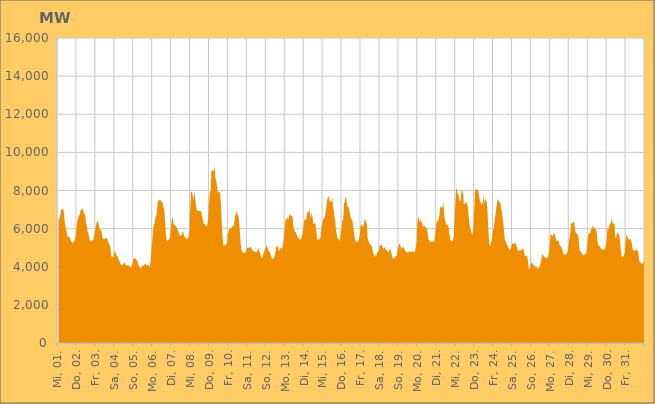
| Category | Series 0 |
|---|---|
|  Mi, 01.  | 6432.189 |
|  Mi, 01.  | 6545.215 |
|  Mi, 01.  | 6547.513 |
|  Mi, 01.  | 6901.822 |
|  Mi, 01.  | 7033.395 |
|  Mi, 01.  | 6983.511 |
|  Mi, 01.  | 7067.825 |
|  Mi, 01.  | 6830.538 |
|  Mi, 01.  | 6334.75 |
|  Mi, 01.  | 6100.284 |
|  Mi, 01.  | 5940.601 |
|  Mi, 01.  | 5646.57 |
|  Mi, 01.  | 5559.385 |
|  Mi, 01.  | 5585.268 |
|  Mi, 01.  | 5539.863 |
|  Mi, 01.  | 5465.039 |
|  Mi, 01.  | 5310.329 |
|  Do, 02.  | 5300.717 |
|  Do, 02.  | 5241.493 |
|  Do, 02.  | 5289.908 |
|  Do, 02.  | 5325.66 |
|  Do, 02.  | 5446.037 |
|  Do, 02.  | 5623.164 |
|  Do, 02.  | 6062.127 |
|  Do, 02.  | 6423.494 |
|  Do, 02.  | 6573.263 |
|  Do, 02.  | 6698.246 |
|  Do, 02.  | 6696.247 |
|  Do, 02.  | 6977.927 |
|  Do, 02.  | 6984.089 |
|  Do, 02.  | 6992.329 |
|  Do, 02.  | 7078.228 |
|  Do, 02.  | 6831.044 |
|  Do, 02.  | 6778.405 |
|  Do, 02.  | 6714.394 |
|  Do, 02.  | 6312.949 |
|  Do, 02.  | 6146.983 |
|  Do, 02.  | 5851.683 |
|  Do, 02.  | 5729.765 |
|  Do, 02.  | 5532.291 |
|  Do, 02.  | 5377.832 |
|  Fr, 03.  | 5333.076 |
|  Fr, 03.  | 5329.212 |
|  Fr, 03.  | 5386.18 |
|  Fr, 03.  | 5387.183 |
|  Fr, 03.  | 5541.794 |
|  Fr, 03.  | 5736.959 |
|  Fr, 03.  | 6015.82 |
|  Fr, 03.  | 6272.881 |
|  Fr, 03.  | 6377.523 |
|  Fr, 03.  | 6374.856 |
|  Fr, 03.  | 6254.357 |
|  Fr, 03.  | 6020.06 |
|  Fr, 03.  | 5908.724 |
|  Fr, 03.  | 5984.108 |
|  Fr, 03.  | 5743.847 |
|  Fr, 03.  | 5483.723 |
|  Fr, 03.  | 5459.95 |
|  Fr, 03.  | 5486.527 |
|  Fr, 03.  | 5451.765 |
|  Fr, 03.  | 5492.21 |
|  Fr, 03.  | 5514.966 |
|  Fr, 03.  | 5483.49 |
|  Fr, 03.  | 5310.554 |
|  Fr, 03.  | 5221.88 |
|  Sa, 04.  | 5140.734 |
|  Sa, 04.  | 4992.717 |
|  Sa, 04.  | 4520.739 |
|  Sa, 04.  | 4540.209 |
|  Sa, 04.  | 4513.63 |
|  Sa, 04.  | 4517.864 |
|  Sa, 04.  | 4829.307 |
|  Sa, 04.  | 4780.2 |
|  Sa, 04.  | 4669.113 |
|  Sa, 04.  | 4563.547 |
|  Sa, 04.  | 4548.749 |
|  Sa, 04.  | 4423.104 |
|  Sa, 04.  | 4321.182 |
|  Sa, 04.  | 4215.574 |
|  Sa, 04.  | 4150.56 |
|  Sa, 04.  | 4078.71 |
|  Sa, 04.  | 4077.027 |
|  Sa, 04.  | 4158.97 |
|  Sa, 04.  | 4192.498 |
|  Sa, 04.  | 4241 |
|  Sa, 04.  | 4085.512 |
|  Sa, 04.  | 4112.892 |
|  Sa, 04.  | 4031.316 |
|  Sa, 04.  | 4084.826 |
|  So, 05.  | 4051.562 |
|  So, 05.  | 3996.195 |
|  So, 05.  | 3998.724 |
|  So, 05.  | 3918.393 |
|  So, 05.  | 4094.268 |
|  So, 05.  | 4151.866 |
|  So, 05.  | 4410.688 |
|  So, 05.  | 4438.842 |
|  So, 05.  | 4440.331 |
|  So, 05.  | 4397.355 |
|  So, 05.  | 4384.611 |
|  So, 05.  | 4299.291 |
|  So, 05.  | 4175.3 |
|  So, 05.  | 3990.685 |
|  So, 05.  | 3976.586 |
|  So, 05.  | 3912.099 |
|  So, 05.  | 3919.865 |
|  So, 05.  | 4035.484 |
|  So, 05.  | 4111.312 |
|  So, 05.  | 4013.534 |
|  So, 05.  | 4125.773 |
|  So, 05.  | 4187.586 |
|  So, 05.  | 4081.242 |
|  So, 05.  | 4077.027 |
|  Mo, 06.  | 4086.107 |
|  Mo, 06.  | 4134.495 |
|  Mo, 06.  | 3980.735 |
|  Mo, 06.  | 4034.878 |
|  Mo, 06.  | 4346.044 |
|  Mo, 06.  | 4869.953 |
|  Mo, 06.  | 5367.1 |
|  Mo, 06.  | 5914.365 |
|  Mo, 06.  | 6238.811 |
|  Mo, 06.  | 6244.058 |
|  Mo, 06.  | 6586.615 |
|  Mo, 06.  | 6661.785 |
|  Mo, 06.  | 6970.841 |
|  Mo, 06.  | 7408.202 |
|  Mo, 06.  | 7461.79 |
|  Mo, 06.  | 7534.47 |
|  Mo, 06.  | 7460.864 |
|  Mo, 06.  | 7505.971 |
|  Mo, 06.  | 7344.519 |
|  Mo, 06.  | 7391.068 |
|  Mo, 06.  | 7114.521 |
|  Mo, 06.  | 7042.037 |
|  Mo, 06.  | 6600.72 |
|  Mo, 06.  | 5789.094 |
|  Di, 07.  | 5408.973 |
|  Di, 07.  | 5345.55 |
|  Di, 07.  | 5394.59 |
|  Di, 07.  | 5407.276 |
|  Di, 07.  | 5491.242 |
|  Di, 07.  | 5680.061 |
|  Di, 07.  | 6148.901 |
|  Di, 07.  | 6555.24 |
|  Di, 07.  | 6570.468 |
|  Di, 07.  | 6251.604 |
|  Di, 07.  | 6169.385 |
|  Di, 07.  | 6199.727 |
|  Di, 07.  | 6102.451 |
|  Di, 07.  | 6070.755 |
|  Di, 07.  | 5977.898 |
|  Di, 07.  | 5824.963 |
|  Di, 07.  | 5750.545 |
|  Di, 07.  | 5605.576 |
|  Di, 07.  | 5630.129 |
|  Di, 07.  | 5643.744 |
|  Di, 07.  | 5844.267 |
|  Di, 07.  | 5821.324 |
|  Di, 07.  | 5681.039 |
|  Di, 07.  | 5559.406 |
|  Mi, 08.  | 5526.208 |
|  Mi, 08.  | 5487.472 |
|  Mi, 08.  | 5418.346 |
|  Mi, 08.  | 5492.679 |
|  Mi, 08.  | 5596.769 |
|  Mi, 08.  | 5858.635 |
|  Mi, 08.  | 6875.682 |
|  Mi, 08.  | 7923.531 |
|  Mi, 08.  | 7939.218 |
|  Mi, 08.  | 7786.351 |
|  Mi, 08.  | 7463.835 |
|  Mi, 08.  | 7909.508 |
|  Mi, 08.  | 7713.217 |
|  Mi, 08.  | 7334.479 |
|  Mi, 08.  | 7039.499 |
|  Mi, 08.  | 6927.108 |
|  Mi, 08.  | 6941.94 |
|  Mi, 08.  | 6926.442 |
|  Mi, 08.  | 6932.826 |
|  Mi, 08.  | 6904.032 |
|  Mi, 08.  | 6931.714 |
|  Mi, 08.  | 6655.38 |
|  Mi, 08.  | 6481.982 |
|  Mi, 08.  | 6286.74 |
|  Do, 09.  | 6244.257 |
|  Do, 09.  | 6205.257 |
|  Do, 09.  | 6117.69 |
|  Do, 09.  | 6141.406 |
|  Do, 09.  | 6213.858 |
|  Do, 09.  | 6678.971 |
|  Do, 09.  | 7334.385 |
|  Do, 09.  | 7920.454 |
|  Do, 09.  | 7958.575 |
|  Do, 09.  | 9056.361 |
|  Do, 09.  | 9044.602 |
|  Do, 09.  | 9066.344 |
|  Do, 09.  | 9002.834 |
|  Do, 09.  | 9272.565 |
|  Do, 09.  | 8669.864 |
|  Do, 09.  | 8517.835 |
|  Do, 09.  | 8205.627 |
|  Do, 09.  | 7964.013 |
|  Do, 09.  | 7887.21 |
|  Do, 09.  | 7901.468 |
|  Do, 09.  | 7910.298 |
|  Do, 09.  | 7246.571 |
|  Do, 09.  | 6341.555 |
|  Do, 09.  | 5608.565 |
|  Fr, 10.  | 5118.057 |
|  Fr, 10.  | 5140.781 |
|  Fr, 10.  | 5102.667 |
|  Fr, 10.  | 5167.676 |
|  Fr, 10.  | 5181.313 |
|  Fr, 10.  | 5302.378 |
|  Fr, 10.  | 5709.381 |
|  Fr, 10.  | 5936.839 |
|  Fr, 10.  | 6003.604 |
|  Fr, 10.  | 6037.304 |
|  Fr, 10.  | 5973.486 |
|  Fr, 10.  | 6170.352 |
|  Fr, 10.  | 6124.762 |
|  Fr, 10.  | 6076.152 |
|  Fr, 10.  | 6361.854 |
|  Fr, 10.  | 6649.129 |
|  Fr, 10.  | 6752.071 |
|  Fr, 10.  | 6950.284 |
|  Fr, 10.  | 6756.815 |
|  Fr, 10.  | 6698.703 |
|  Fr, 10.  | 6383.654 |
|  Fr, 10.  | 5856.289 |
|  Fr, 10.  | 5261.557 |
|  Fr, 10.  | 4857.342 |
|  Sa, 11.  | 4816.497 |
|  Sa, 11.  | 4717.448 |
|  Sa, 11.  | 4730.779 |
|  Sa, 11.  | 4736.928 |
|  Sa, 11.  | 4733.401 |
|  Sa, 11.  | 4797.706 |
|  Sa, 11.  | 4990.911 |
|  Sa, 11.  | 5012.251 |
|  Sa, 11.  | 5009.106 |
|  Sa, 11.  | 4994.828 |
|  Sa, 11.  | 5020.215 |
|  Sa, 11.  | 5044.988 |
|  Sa, 11.  | 4945.124 |
|  Sa, 11.  | 4848.309 |
|  Sa, 11.  | 4828.483 |
|  Sa, 11.  | 4817.915 |
|  Sa, 11.  | 4763.25 |
|  Sa, 11.  | 4764.954 |
|  Sa, 11.  | 4764.098 |
|  Sa, 11.  | 4793.053 |
|  Sa, 11.  | 4948.968 |
|  Sa, 11.  | 4937.129 |
|  Sa, 11.  | 4788.311 |
|  Sa, 11.  | 4631.645 |
|  So, 12.  | 4544.594 |
|  So, 12.  | 4453.896 |
|  So, 12.  | 4488.792 |
|  So, 12.  | 4740.289 |
|  So, 12.  | 4825.721 |
|  So, 12.  | 4931.086 |
|  So, 12.  | 4976.784 |
|  So, 12.  | 5168.841 |
|  So, 12.  | 5034.123 |
|  So, 12.  | 4875.734 |
|  So, 12.  | 4832.097 |
|  So, 12.  | 4721.07 |
|  So, 12.  | 4610.855 |
|  So, 12.  | 4515.428 |
|  So, 12.  | 4418.938 |
|  So, 12.  | 4385.718 |
|  So, 12.  | 4445.788 |
|  So, 12.  | 4528.651 |
|  So, 12.  | 4742.813 |
|  So, 12.  | 5008.71 |
|  So, 12.  | 5092.76 |
|  So, 12.  | 5077.151 |
|  So, 12.  | 4833.736 |
|  So, 12.  | 4842.457 |
|  Mo, 13.  | 4988.085 |
|  Mo, 13.  | 4974.977 |
|  Mo, 13.  | 4893.55 |
|  Mo, 13.  | 5082.106 |
|  Mo, 13.  | 5263.83 |
|  Mo, 13.  | 5567.088 |
|  Mo, 13.  | 6093.246 |
|  Mo, 13.  | 6523.03 |
|  Mo, 13.  | 6459.348 |
|  Mo, 13.  | 6654.612 |
|  Mo, 13.  | 6439.946 |
|  Mo, 13.  | 6529.272 |
|  Mo, 13.  | 6724.267 |
|  Mo, 13.  | 6762.513 |
|  Mo, 13.  | 6654.413 |
|  Mo, 13.  | 6657.81 |
|  Mo, 13.  | 6538.919 |
|  Mo, 13.  | 6033.566 |
|  Mo, 13.  | 5947.788 |
|  Mo, 13.  | 5807.496 |
|  Mo, 13.  | 5824.847 |
|  Mo, 13.  | 5685.974 |
|  Mo, 13.  | 5559.084 |
|  Mo, 13.  | 5560.489 |
|  Di, 14.  | 5455.978 |
|  Di, 14.  | 5411.861 |
|  Di, 14.  | 5452.754 |
|  Di, 14.  | 5474.387 |
|  Di, 14.  | 5613.657 |
|  Di, 14.  | 5878.572 |
|  Di, 14.  | 6276.342 |
|  Di, 14.  | 6489.839 |
|  Di, 14.  | 6493.187 |
|  Di, 14.  | 6414.928 |
|  Di, 14.  | 6781.622 |
|  Di, 14.  | 6899.244 |
|  Di, 14.  | 6823.975 |
|  Di, 14.  | 7038.672 |
|  Di, 14.  | 6751.466 |
|  Di, 14.  | 6506.957 |
|  Di, 14.  | 6865.055 |
|  Di, 14.  | 6646.156 |
|  Di, 14.  | 6236.148 |
|  Di, 14.  | 6266.64 |
|  Di, 14.  | 6320.091 |
|  Di, 14.  | 6145.898 |
|  Di, 14.  | 5858.031 |
|  Di, 14.  | 5441.387 |
|  Mi, 15.  | 5365.633 |
|  Mi, 15.  | 5481.591 |
|  Mi, 15.  | 5451.426 |
|  Mi, 15.  | 5482.707 |
|  Mi, 15.  | 5943.905 |
|  Mi, 15.  | 6157.883 |
|  Mi, 15.  | 6375.539 |
|  Mi, 15.  | 6519.376 |
|  Mi, 15.  | 6568.058 |
|  Mi, 15.  | 6641.351 |
|  Mi, 15.  | 6985.18 |
|  Mi, 15.  | 7267.223 |
|  Mi, 15.  | 7583.222 |
|  Mi, 15.  | 7715.765 |
|  Mi, 15.  | 7625.234 |
|  Mi, 15.  | 7367.856 |
|  Mi, 15.  | 7416.664 |
|  Mi, 15.  | 7418.877 |
|  Mi, 15.  | 7657.66 |
|  Mi, 15.  | 7164.366 |
|  Mi, 15.  | 6971.208 |
|  Mi, 15.  | 6579.811 |
|  Mi, 15.  | 6379.543 |
|  Mi, 15.  | 5874.329 |
|  Do, 16.  | 5629.912 |
|  Do, 16.  | 5488.079 |
|  Do, 16.  | 5453.622 |
|  Do, 16.  | 5317.596 |
|  Do, 16.  | 5445.179 |
|  Do, 16.  | 5727.747 |
|  Do, 16.  | 6070.183 |
|  Do, 16.  | 6482.532 |
|  Do, 16.  | 6429.243 |
|  Do, 16.  | 7328.717 |
|  Do, 16.  | 7399.6 |
|  Do, 16.  | 7704.249 |
|  Do, 16.  | 7537.075 |
|  Do, 16.  | 7158.356 |
|  Do, 16.  | 7177.171 |
|  Do, 16.  | 7088.932 |
|  Do, 16.  | 6888.273 |
|  Do, 16.  | 6694.481 |
|  Do, 16.  | 6431.258 |
|  Do, 16.  | 6582.17 |
|  Do, 16.  | 6290.071 |
|  Do, 16.  | 6007.884 |
|  Do, 16.  | 5669.406 |
|  Do, 16.  | 5410.609 |
|  Fr, 17.  | 5333.906 |
|  Fr, 17.  | 5306.443 |
|  Fr, 17.  | 5274.779 |
|  Fr, 17.  | 5321.512 |
|  Fr, 17.  | 5480.704 |
|  Fr, 17.  | 5633.583 |
|  Fr, 17.  | 6115.531 |
|  Fr, 17.  | 6233.811 |
|  Fr, 17.  | 6173.681 |
|  Fr, 17.  | 6095.939 |
|  Fr, 17.  | 6162.593 |
|  Fr, 17.  | 6505.184 |
|  Fr, 17.  | 6457.856 |
|  Fr, 17.  | 6336.969 |
|  Fr, 17.  | 6231.604 |
|  Fr, 17.  | 5489.921 |
|  Fr, 17.  | 5369.647 |
|  Fr, 17.  | 5255.822 |
|  Fr, 17.  | 5178.818 |
|  Fr, 17.  | 5171.887 |
|  Fr, 17.  | 5045.025 |
|  Fr, 17.  | 4928.77 |
|  Fr, 17.  | 4713 |
|  Fr, 17.  | 4626.61 |
|  Sa, 18.  | 4520.267 |
|  Sa, 18.  | 4624.376 |
|  Sa, 18.  | 4577.068 |
|  Sa, 18.  | 4755.326 |
|  Sa, 18.  | 4801.279 |
|  Sa, 18.  | 4798.432 |
|  Sa, 18.  | 5083.276 |
|  Sa, 18.  | 5092.189 |
|  Sa, 18.  | 5152.022 |
|  Sa, 18.  | 5140.321 |
|  Sa, 18.  | 5000.28 |
|  Sa, 18.  | 4915.656 |
|  Sa, 18.  | 5041.086 |
|  Sa, 18.  | 4984.222 |
|  Sa, 18.  | 4851.161 |
|  Sa, 18.  | 4906.766 |
|  Sa, 18.  | 4824.768 |
|  Sa, 18.  | 4752.459 |
|  Sa, 18.  | 4767.788 |
|  Sa, 18.  | 4949.749 |
|  Sa, 18.  | 4900.707 |
|  Sa, 18.  | 4746.932 |
|  Sa, 18.  | 4525.613 |
|  Sa, 18.  | 4424.328 |
|  So, 19.  | 4477.872 |
|  So, 19.  | 4447.882 |
|  So, 19.  | 4547.452 |
|  So, 19.  | 4530.999 |
|  So, 19.  | 4641.91 |
|  So, 19.  | 4831.258 |
|  So, 19.  | 5038.062 |
|  So, 19.  | 5224.994 |
|  So, 19.  | 5176.374 |
|  So, 19.  | 5018.141 |
|  So, 19.  | 4918.391 |
|  So, 19.  | 5045.843 |
|  So, 19.  | 5024.135 |
|  So, 19.  | 5001.422 |
|  So, 19.  | 4853.505 |
|  So, 19.  | 4808.358 |
|  So, 19.  | 4807.395 |
|  So, 19.  | 4715.442 |
|  So, 19.  | 4726.697 |
|  So, 19.  | 4777.87 |
|  So, 19.  | 4801.317 |
|  So, 19.  | 4822.244 |
|  So, 19.  | 4748.168 |
|  So, 19.  | 4794.939 |
|  Mo, 20.  | 4802.96 |
|  Mo, 20.  | 4808.074 |
|  Mo, 20.  | 4756.099 |
|  Mo, 20.  | 4754.025 |
|  Mo, 20.  | 5083.369 |
|  Mo, 20.  | 5293.754 |
|  Mo, 20.  | 6301.903 |
|  Mo, 20.  | 6605.361 |
|  Mo, 20.  | 6567.503 |
|  Mo, 20.  | 6382.233 |
|  Mo, 20.  | 6388.743 |
|  Mo, 20.  | 6383.937 |
|  Mo, 20.  | 6211.965 |
|  Mo, 20.  | 6130.845 |
|  Mo, 20.  | 6104.223 |
|  Mo, 20.  | 6156.347 |
|  Mo, 20.  | 6065.637 |
|  Mo, 20.  | 6005.625 |
|  Mo, 20.  | 6016.557 |
|  Mo, 20.  | 5743.153 |
|  Mo, 20.  | 5460.902 |
|  Mo, 20.  | 5389.448 |
|  Mo, 20.  | 5332.56 |
|  Mo, 20.  | 5307.433 |
|  Di, 21.  | 5303.928 |
|  Di, 21.  | 5339.538 |
|  Di, 21.  | 5337.287 |
|  Di, 21.  | 5255.12 |
|  Di, 21.  | 5499.273 |
|  Di, 21.  | 5797.62 |
|  Di, 21.  | 6253.985 |
|  Di, 21.  | 6426.251 |
|  Di, 21.  | 6378.829 |
|  Di, 21.  | 6537.806 |
|  Di, 21.  | 6727.516 |
|  Di, 21.  | 7159.301 |
|  Di, 21.  | 7163.916 |
|  Di, 21.  | 7061.781 |
|  Di, 21.  | 7144.179 |
|  Di, 21.  | 7392.529 |
|  Di, 21.  | 6692.183 |
|  Di, 21.  | 6465.051 |
|  Di, 21.  | 6300.135 |
|  Di, 21.  | 6169.698 |
|  Di, 21.  | 6260.59 |
|  Di, 21.  | 6128.506 |
|  Di, 21.  | 5985.263 |
|  Di, 21.  | 5559.124 |
|  Mi, 22.  | 5408.242 |
|  Mi, 22.  | 5334.832 |
|  Mi, 22.  | 5351.111 |
|  Mi, 22.  | 5380.72 |
|  Mi, 22.  | 5600.526 |
|  Mi, 22.  | 6256.168 |
|  Mi, 22.  | 7181.526 |
|  Mi, 22.  | 8073.064 |
|  Mi, 22.  | 8072.66 |
|  Mi, 22.  | 7859.075 |
|  Mi, 22.  | 7792.193 |
|  Mi, 22.  | 7550.487 |
|  Mi, 22.  | 7403.602 |
|  Mi, 22.  | 7537.453 |
|  Mi, 22.  | 8074.146 |
|  Mi, 22.  | 7960.584 |
|  Mi, 22.  | 7817.801 |
|  Mi, 22.  | 7258.759 |
|  Mi, 22.  | 7285.246 |
|  Mi, 22.  | 7375.989 |
|  Mi, 22.  | 7396.033 |
|  Mi, 22.  | 7295 |
|  Mi, 22.  | 7095.24 |
|  Mi, 22.  | 6671.204 |
|  Do, 23.  | 6228.97 |
|  Do, 23.  | 5940.523 |
|  Do, 23.  | 5921.492 |
|  Do, 23.  | 5705.996 |
|  Do, 23.  | 5721.541 |
|  Do, 23.  | 6002.974 |
|  Do, 23.  | 6907.295 |
|  Do, 23.  | 7968.546 |
|  Do, 23.  | 8139.502 |
|  Do, 23.  | 7998.317 |
|  Do, 23.  | 8067.312 |
|  Do, 23.  | 8002.173 |
|  Do, 23.  | 7767.789 |
|  Do, 23.  | 7513.743 |
|  Do, 23.  | 7400.422 |
|  Do, 23.  | 7263.726 |
|  Do, 23.  | 7268.806 |
|  Do, 23.  | 7347.945 |
|  Do, 23.  | 7728.531 |
|  Do, 23.  | 7284.93 |
|  Do, 23.  | 7555.835 |
|  Do, 23.  | 7498.159 |
|  Do, 23.  | 7365.847 |
|  Do, 23.  | 6783.162 |
|  Fr, 24.  | 5923.972 |
|  Fr, 24.  | 5170.537 |
|  Fr, 24.  | 5167.581 |
|  Fr, 24.  | 5092.624 |
|  Fr, 24.  | 5404.924 |
|  Fr, 24.  | 5659.903 |
|  Fr, 24.  | 5911.782 |
|  Fr, 24.  | 6080.099 |
|  Fr, 24.  | 6456.592 |
|  Fr, 24.  | 6744.308 |
|  Fr, 24.  | 7077.942 |
|  Fr, 24.  | 7364.631 |
|  Fr, 24.  | 7572.899 |
|  Fr, 24.  | 7442.753 |
|  Fr, 24.  | 7344.623 |
|  Fr, 24.  | 7444.569 |
|  Fr, 24.  | 7055.508 |
|  Fr, 24.  | 6909.982 |
|  Fr, 24.  | 6562.248 |
|  Fr, 24.  | 6294.041 |
|  Fr, 24.  | 5736.532 |
|  Fr, 24.  | 5379.965 |
|  Fr, 24.  | 5331.464 |
|  Fr, 24.  | 5227.462 |
|  Sa, 25.  | 5105.704 |
|  Sa, 25.  | 5044.739 |
|  Sa, 25.  | 4936.238 |
|  Sa, 25.  | 4857.401 |
|  Sa, 25.  | 4928.506 |
|  Sa, 25.  | 4978.557 |
|  Sa, 25.  | 5191.087 |
|  Sa, 25.  | 5219.682 |
|  Sa, 25.  | 5187.673 |
|  Sa, 25.  | 5238.428 |
|  Sa, 25.  | 5284.757 |
|  Sa, 25.  | 5155.954 |
|  Sa, 25.  | 5034.93 |
|  Sa, 25.  | 4893.81 |
|  Sa, 25.  | 4834.345 |
|  Sa, 25.  | 4887.723 |
|  Sa, 25.  | 4834.144 |
|  Sa, 25.  | 4867.615 |
|  Sa, 25.  | 4895.113 |
|  Sa, 25.  | 4925.233 |
|  Sa, 25.  | 4970.979 |
|  Sa, 25.  | 4813.963 |
|  Sa, 25.  | 4614.286 |
|  Sa, 25.  | 4524.527 |
|  So, 26.  | 4598.2 |
|  So, 26.  | 4566.184 |
|  So, 26.  | 4360.426 |
|  So, 26.  | 3925.507 |
|  So, 26.  | 3854.307 |
|  So, 26.  | 3963.629 |
|  So, 26.  | 4207.117 |
|  So, 26.  | 4224.445 |
|  So, 26.  | 4158.92 |
|  So, 26.  | 4084.248 |
|  So, 26.  | 4052.405 |
|  So, 26.  | 4032.7 |
|  So, 26.  | 3943.151 |
|  So, 26.  | 3980.182 |
|  So, 26.  | 3924.262 |
|  So, 26.  | 3848.495 |
|  So, 26.  | 3956.225 |
|  So, 26.  | 3958.628 |
|  So, 26.  | 4197.536 |
|  So, 26.  | 4342.063 |
|  So, 26.  | 4581.812 |
|  So, 26.  | 4695.907 |
|  So, 26.  | 4550.239 |
|  So, 26.  | 4502.482 |
|  Mo, 27.  | 4513.699 |
|  Mo, 27.  | 4450.298 |
|  Mo, 27.  | 4433.249 |
|  Mo, 27.  | 4474.785 |
|  Mo, 27.  | 4592.947 |
|  Mo, 27.  | 4821.938 |
|  Mo, 27.  | 5337.751 |
|  Mo, 27.  | 5690.638 |
|  Mo, 27.  | 5684.444 |
|  Mo, 27.  | 5587.463 |
|  Mo, 27.  | 5662.607 |
|  Mo, 27.  | 5804.922 |
|  Mo, 27.  | 5682.065 |
|  Mo, 27.  | 5553.555 |
|  Mo, 27.  | 5378.428 |
|  Mo, 27.  | 5333.182 |
|  Mo, 27.  | 5399.982 |
|  Mo, 27.  | 5357.213 |
|  Mo, 27.  | 5158.327 |
|  Mo, 27.  | 5067.926 |
|  Mo, 27.  | 5082.694 |
|  Mo, 27.  | 4958.313 |
|  Mo, 27.  | 4859.788 |
|  Mo, 27.  | 4692.06 |
|  Di, 28.  | 4631.624 |
|  Di, 28.  | 4665.732 |
|  Di, 28.  | 4623.964 |
|  Di, 28.  | 4671.857 |
|  Di, 28.  | 4749.728 |
|  Di, 28.  | 4870.067 |
|  Di, 28.  | 5343.234 |
|  Di, 28.  | 5506.642 |
|  Di, 28.  | 5816.351 |
|  Di, 28.  | 6271.707 |
|  Di, 28.  | 6286.967 |
|  Di, 28.  | 6285.344 |
|  Di, 28.  | 6387.462 |
|  Di, 28.  | 6306.336 |
|  Di, 28.  | 5885.943 |
|  Di, 28.  | 5791.636 |
|  Di, 28.  | 5721.492 |
|  Di, 28.  | 5683.646 |
|  Di, 28.  | 5640.939 |
|  Di, 28.  | 5113.077 |
|  Di, 28.  | 4810.611 |
|  Di, 28.  | 4815.656 |
|  Di, 28.  | 4705.586 |
|  Di, 28.  | 4688.395 |
|  Mi, 29.  | 4597.543 |
|  Mi, 29.  | 4597.969 |
|  Mi, 29.  | 4634.106 |
|  Mi, 29.  | 4667.645 |
|  Mi, 29.  | 4701.269 |
|  Mi, 29.  | 4984.738 |
|  Mi, 29.  | 5469.906 |
|  Mi, 29.  | 5740.92 |
|  Mi, 29.  | 5778.431 |
|  Mi, 29.  | 5751.035 |
|  Mi, 29.  | 5994.985 |
|  Mi, 29.  | 5945.278 |
|  Mi, 29.  | 6163.833 |
|  Mi, 29.  | 6034.837 |
|  Mi, 29.  | 6085.279 |
|  Mi, 29.  | 5990.793 |
|  Mi, 29.  | 5968.127 |
|  Mi, 29.  | 5894.787 |
|  Mi, 29.  | 5450.607 |
|  Mi, 29.  | 5137.866 |
|  Mi, 29.  | 5104.096 |
|  Mi, 29.  | 5086.767 |
|  Mi, 29.  | 5013.87 |
|  Mi, 29.  | 4939.222 |
|  Do, 30.  | 4883.823 |
|  Do, 30.  | 4959.467 |
|  Do, 30.  | 4893.501 |
|  Do, 30.  | 4879.197 |
|  Do, 30.  | 4945.272 |
|  Do, 30.  | 5115.942 |
|  Do, 30.  | 5490.283 |
|  Do, 30.  | 6066.295 |
|  Do, 30.  | 5957.701 |
|  Do, 30.  | 6042.792 |
|  Do, 30.  | 6282.052 |
|  Do, 30.  | 6255.685 |
|  Do, 30.  | 6535.724 |
|  Do, 30.  | 6315.623 |
|  Do, 30.  | 6277.927 |
|  Do, 30.  | 6266.67 |
|  Do, 30.  | 6171.951 |
|  Do, 30.  | 5494.274 |
|  Do, 30.  | 5506.746 |
|  Do, 30.  | 5788.539 |
|  Do, 30.  | 5745.565 |
|  Do, 30.  | 5723.568 |
|  Do, 30.  | 5597.776 |
|  Do, 30.  | 5265.884 |
|  Fr, 31.  | 4811.64 |
|  Fr, 31.  | 4535.753 |
|  Fr, 31.  | 4517.832 |
|  Fr, 31.  | 4543.187 |
|  Fr, 31.  | 4606.924 |
|  Fr, 31.  | 4780.224 |
|  Fr, 31.  | 5467.788 |
|  Fr, 31.  | 5694.159 |
|  Fr, 31.  | 5615.66 |
|  Fr, 31.  | 5468.635 |
|  Fr, 31.  | 5453.768 |
|  Fr, 31.  | 5400.381 |
|  Fr, 31.  | 5486.095 |
|  Fr, 31.  | 5312.836 |
|  Fr, 31.  | 5195.56 |
|  Fr, 31.  | 4884.598 |
|  Fr, 31.  | 4818.789 |
|  Fr, 31.  | 4868.834 |
|  Fr, 31.  | 4806.234 |
|  Fr, 31.  | 4920.202 |
|  Fr, 31.  | 4898.162 |
|  Fr, 31.  | 4842.649 |
|  Fr, 31.  | 4746.438 |
|  Fr, 31.  | 4330.65 |
|  Sa, 01.  | 4255.109 |
|  Sa, 01.  | 4214.43 |
|  Sa, 01.  | 4164.499 |
|  Sa, 01.  | 4159.569 |
|  Sa, 01.  | 4217.43 |
|  Sa, 01.  | 4281.717 |